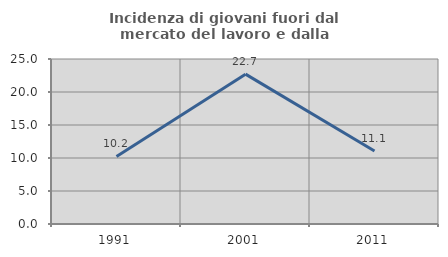
| Category | Incidenza di giovani fuori dal mercato del lavoro e dalla formazione  |
|---|---|
| 1991.0 | 10.23 |
| 2001.0 | 22.705 |
| 2011.0 | 11.063 |